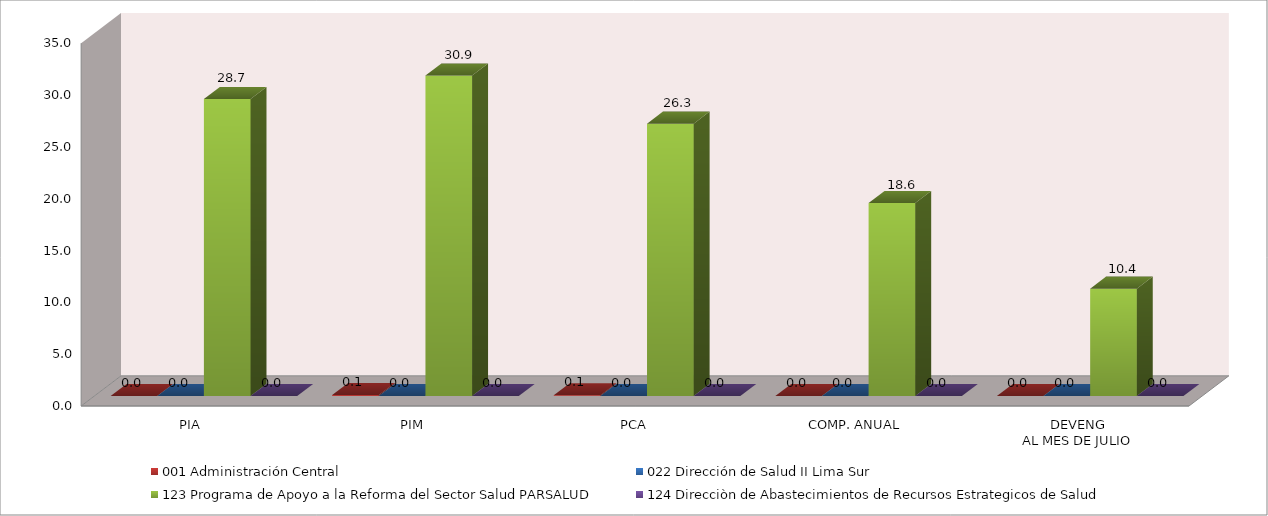
| Category | 001 Administración Central | 022 Dirección de Salud II Lima Sur | 123 Programa de Apoyo a la Reforma del Sector Salud PARSALUD | 124 Direcciòn de Abastecimientos de Recursos Estrategicos de Salud |
|---|---|---|---|---|
| PIA | 0 | 0 | 28.656 | 0 |
| PIM | 0.095 | 0 | 30.911 | 0 |
| PCA | 0.08 | 0 | 26.274 | 0 |
| COMP. ANUAL | 0 | 0 | 18.617 | 0 |
| DEVENG
AL MES DE JULIO | 0 | 0 | 10.361 | 0 |